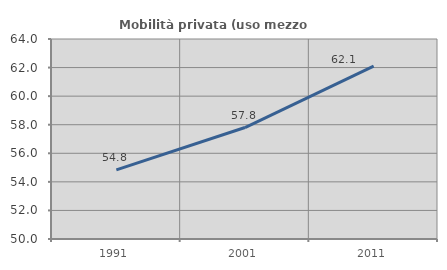
| Category | Mobilità privata (uso mezzo privato) |
|---|---|
| 1991.0 | 54.839 |
| 2001.0 | 57.803 |
| 2011.0 | 62.1 |